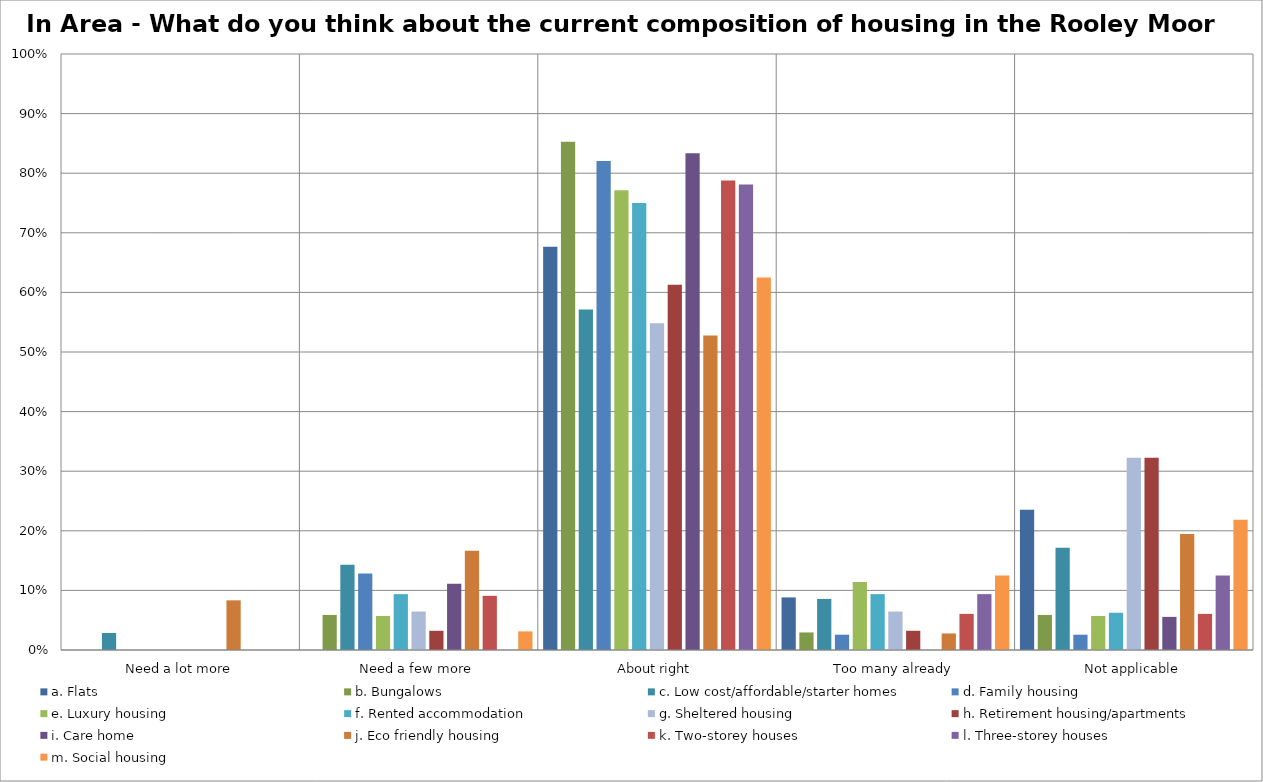
| Category | a. Flats | b. Bungalows | c. Low cost/affordable/starter homes | d. Family housing | e. Luxury housing | f. Rented accommodation | g. Sheltered housing | h. Retirement housing/apartments | i. Care home | j. Eco friendly housing | k. Two-storey houses | l. Three-storey houses | m. Social housing |
|---|---|---|---|---|---|---|---|---|---|---|---|---|---|
| Need a lot more | 0 | 0 | 0.029 | 0 | 0 | 0 | 0 | 0 | 0 | 0.083 | 0 | 0 | 0 |
| Need a few more | 0 | 0.059 | 0.143 | 0.128 | 0.057 | 0.094 | 0.065 | 0.032 | 0.111 | 0.167 | 0.091 | 0 | 0.031 |
| About right | 0.676 | 0.853 | 0.571 | 0.821 | 0.771 | 0.75 | 0.548 | 0.613 | 0.833 | 0.528 | 0.788 | 0.781 | 0.625 |
| Too many already | 0.088 | 0.029 | 0.086 | 0.026 | 0.114 | 0.094 | 0.065 | 0.032 | 0 | 0.028 | 0.061 | 0.094 | 0.125 |
| Not applicable | 0.235 | 0.059 | 0.171 | 0.026 | 0.057 | 0.062 | 0.323 | 0.323 | 0.056 | 0.194 | 0.061 | 0.125 | 0.219 |